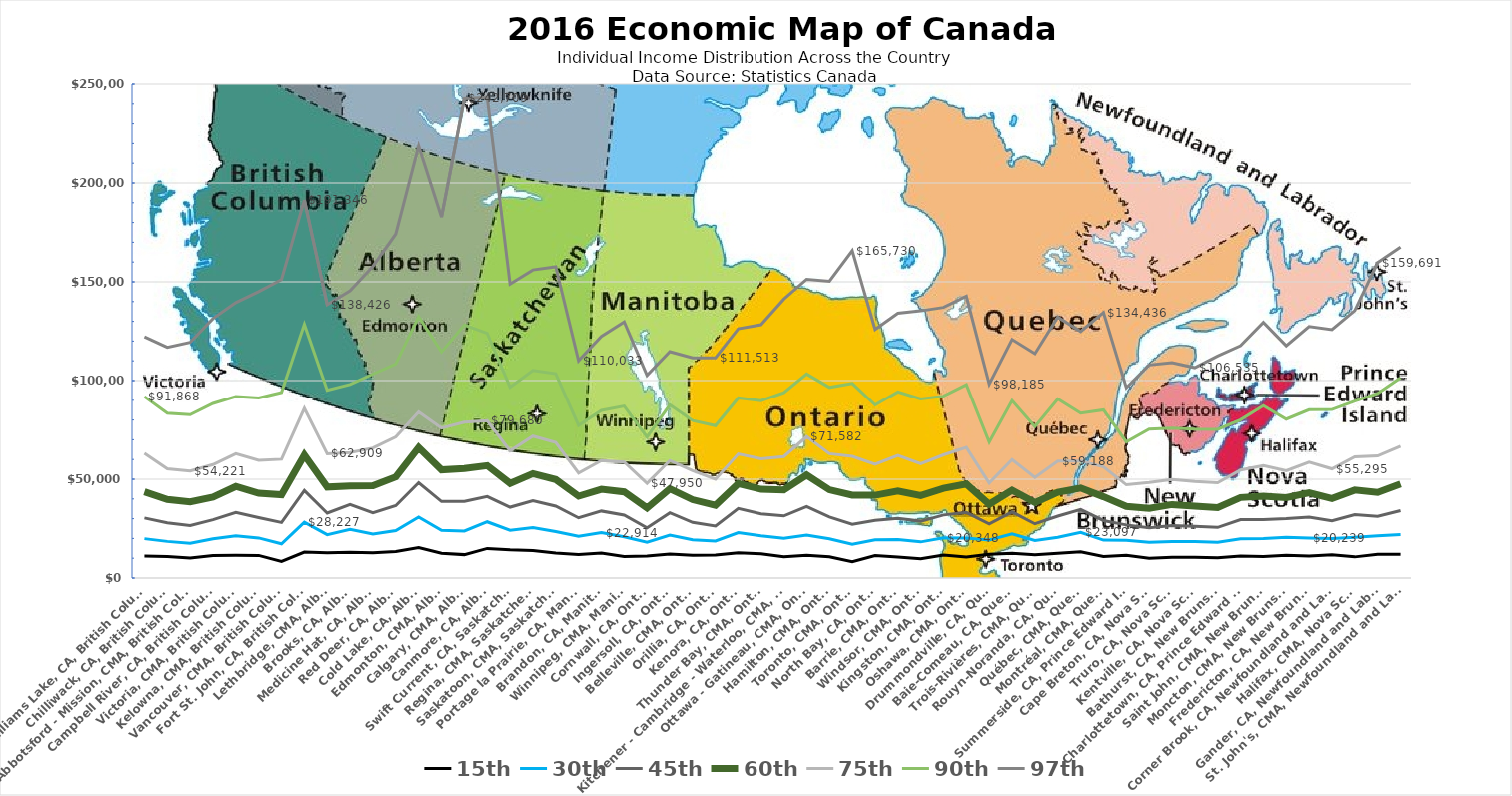
| Category | 15th | 30th | 45th | 60th | 75th | 90th | 97th |
|---|---|---|---|---|---|---|---|
| Williams Lake, CA, British Columbia | 11049 | 19889 | 30351 | 43611 | 63082 | 91868 | 122148 |
| Chilliwack, CA, British Columbia | 10863 | 18495 | 27887 | 39768 | 55303 | 83482 | 116869 |
| Abbotsford - Mission, CMA, British Columbia | 10103 | 17607 | 26530 | 38575 | 54221 | 82705 | 119340 |
| Campbell River, CA, British Columbia | 11394 | 19860 | 29471 | 40968 | 57450 | 88410 | 131366 |
| Victoria, CMA, British Columbia | 11438 | 21362 | 33221 | 46356 | 62916 | 91906 | 139473 |
| Kelowna, CMA, British Columbia | 11424 | 20247 | 30551 | 42896 | 59578 | 91223 | 145054 |
| Vancouver, CMA, British Columbia | 8362 | 17311 | 28099 | 42161 | 60163 | 93958 | 151154 |
| Fort St. John, CA, British Columbia | 13123 | 28227 | 44233 | 62215 | 85966 | 128423 | 191346 |
| Lethbridge, CMA, Alberta | 12721 | 21905 | 32854 | 46060 | 62909 | 95097 | 138426 |
| Brooks, CA, Alberta | 13020 | 24592 | 37194 | 46620 | 63523 | 98014 | 145440 |
| Medicine Hat, CA, Alberta | 12710 | 22194 | 32943 | 46767 | 65846 | 103284 | 157862 |
| Red Deer, CA, Alberta | 13335 | 24020 | 36637 | 51173 | 71412 | 108373 | 174124 |
| Cold Lake, CA, Alberta | 15342 | 30779 | 48241 | 66060 | 84108 | 132265 | 218685 |
| Edmonton, CMA, Alberta | 12482 | 24076 | 38744 | 54766 | 75893 | 114471 | 182672 |
| Calgary, CMA, Alberta | 11807 | 23745 | 38751 | 55388 | 78900 | 128151 | 242709 |
| Canmore, CA, Alberta | 14948 | 28424 | 41275 | 56896 | 79680 | 123952 | 243265 |
| Swift Current, CA, Saskatchewan | 14265 | 24175 | 35831 | 47922 | 64414 | 96637 | 148851 |
| Regina, CMA, Saskatchewan | 13889 | 25495 | 39108 | 52857 | 71857 | 105143 | 155996 |
| Saskatoon, CMA, Saskatchewan | 12666 | 23472 | 36345 | 49833 | 68603 | 103490 | 157619 |
| Portage la Prairie, CA, Manitoba | 11885 | 21053 | 30449 | 41408 | 53167 | 77318 | 110033 |
| Brandon, CA, Manitoba | 12562 | 22914 | 33889 | 44906 | 59469 | 84865 | 122404 |
| Winnipeg, CMA, Manitoba | 10892 | 20861 | 31823 | 43580 | 58723 | 87054 | 129736 |
| Cornwall, CA, Ontario | 11160 | 18056 | 25325 | 35429 | 47950 | 71392 | 102609 |
| Ingersoll, CA, Ontario | 12117 | 21669 | 32975 | 45171 | 59503 | 87743 | 114664 |
| Belleville, CMA, Ontario | 11537 | 19320 | 28118 | 39623 | 54371 | 79743 | 111541 |
| Orillia, CA, Ontario | 11615 | 18705 | 26260 | 36801 | 50006 | 77125 | 111513 |
| Kenora, CA, Ontario | 12713 | 22915 | 35166 | 47769 | 62837 | 91182 | 126188 |
| Thunder Bay, CMA, Ontario | 12190 | 21292 | 32433 | 44928 | 60378 | 89795 | 128271 |
| Kitchener - Cambridge - Waterloo, CMA, Ontario | 10725 | 20090 | 31420 | 44606 | 61500 | 93806 | 141210 |
| Ottawa - Gatineau, CMA, Ontario | 11477 | 21671 | 36141 | 52145 | 71582 | 103321 | 151287 |
| Hamilton, CMA, Ontario | 10734 | 19821 | 30879 | 44653 | 62916 | 96544 | 150290 |
| Toronto, CMA, Ontario | 8251 | 17107 | 27158 | 41936 | 61620 | 98582 | 165730 |
| North Bay, CA, Ontario | 11345 | 19282 | 29213 | 41880 | 57616 | 87631 | 125917 |
| Barrie, CMA, Ontario | 10552 | 19478 | 30222 | 44011 | 62114 | 94256 | 134092 |
| Windsor, CMA, Ontario | 9691 | 18253 | 28735 | 41756 | 57914 | 90659 | 135297 |
| Kingston, CMA, Ontario | 11579 | 20348 | 31878 | 45369 | 62367 | 92107 | 137059 |
| Oshawa, CMA, Ontario | 10552 | 20227 | 33147 | 47541 | 66099 | 97939 | 142669 |
| Drummondville, CA, Quebec | 11956 | 19228 | 27400 | 37322 | 48070 | 68823 | 98185 |
| Baie-Comeau, CA, Quebec | 12515 | 22287 | 33429 | 44452 | 59948 | 89905 | 120796 |
| Trois-Rivières, CMA, Quebec | 11753 | 18913 | 27408 | 38189 | 50956 | 76666 | 113614 |
| Rouyn-Noranda, CA, Quebec | 12481 | 20594 | 31320 | 43437 | 59188 | 90621 | 132141 |
| Québec, CMA, Quebec | 13243 | 23097 | 34638 | 45529 | 59272 | 83460 | 124860 |
| Montréal, CMA, Quebec | 10881 | 19159 | 29071 | 41106 | 56313 | 85136 | 134436 |
| Summerside, CA, Prince Edward Island | 11517 | 19040 | 26835 | 36240 | 47191 | 68968 | 96365 |
| Cape Breton, CA, Nova Scotia | 10026 | 18018 | 25387 | 35253 | 48318 | 75426 | 107890 |
| Truro, CA, Nova Scotia | 10520 | 18449 | 26470 | 37164 | 49918 | 75887 | 109132 |
| Kentville, CA, Nova Scotia | 10466 | 18439 | 26082 | 36309 | 48905 | 75318 | 106535 |
| Bathurst, CA, New Brunswick | 10267 | 18101 | 25606 | 35637 | 48232 | 75300 | 112439 |
| Charlottetown, CA, Prince Edward Island | 11105 | 19832 | 29541 | 40730 | 54657 | 80118 | 117652 |
| Saint John, CMA, New Brunswick | 10877 | 20005 | 29545 | 41444 | 56959 | 87299 | 129430 |
| Moncton, CMA, New Brunswick | 11512 | 20558 | 30058 | 40676 | 54351 | 80440 | 117599 |
| Fredericton, CA, New Brunswick | 11071 | 20239 | 30861 | 43094 | 58696 | 85168 | 127345 |
| Corner Brook, CA, Newfoundland and Labrador | 11699 | 19991 | 28982 | 40248 | 55295 | 85289 | 125766 |
| Halifax, CMA, Nova Scotia | 10674 | 20619 | 32056 | 44507 | 61366 | 89579 | 135442 |
| Gander, CA, Newfoundland and Labrador | 12036 | 21393 | 31164 | 43307 | 61828 | 93468 | 159691 |
| St. John's, CMA, Newfoundland and Labrador | 12005 | 21930 | 34112 | 47592 | 66763 | 101396 | 167544 |